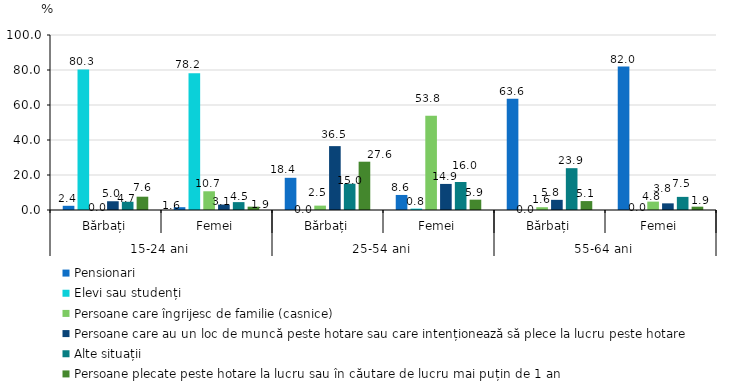
| Category | Pensionari | Elevi sau studenți | Persoane care îngrijesc de familie (casnice) | Persoane care au un loc de muncă peste hotare sau care intenționează să plece la lucru peste hotare | Alte situații | Persoane plecate peste hotare la lucru sau în căutare de lucru mai puțin de 1 an |
|---|---|---|---|---|---|---|
| 0 | 2.4 | 80.3 | 0 | 5 | 4.7 | 7.6 |
| 1 | 1.6 | 78.2 | 10.7 | 3.1 | 4.5 | 1.9 |
| 2 | 18.4 | 0 | 2.5 | 36.5 | 15 | 27.6 |
| 3 | 8.6 | 0.8 | 53.8 | 14.9 | 16 | 5.9 |
| 4 | 63.6 | 0 | 1.6 | 5.8 | 23.9 | 5.1 |
| 5 | 82 | 0 | 4.8 | 3.8 | 7.5 | 1.9 |